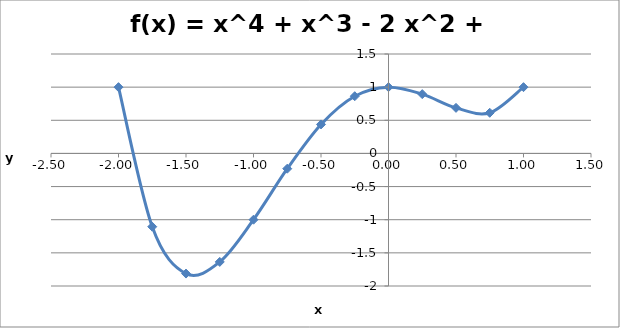
| Category | Series 0 |
|---|---|
| -2.0 | 1 |
| -1.75 | -1.105 |
| -1.5 | -1.812 |
| -1.25 | -1.637 |
| -1.0 | -1 |
| -0.75 | -0.23 |
| -0.5 | 0.438 |
| -0.25 | 0.863 |
| 0.0 | 1 |
| 0.25 | 0.895 |
| 0.5 | 0.688 |
| 0.75 | 0.613 |
| 1.0 | 1 |